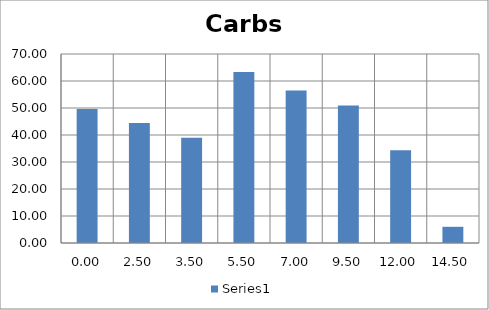
| Category | Series 0 |
|---|---|
| 0.0 | 49.584 |
| 2.5 | 44.4 |
| 3.5 | 39 |
| 5.5 | 63.3 |
| 7.0 | 56.52 |
| 9.5 | 50.97 |
| 12.0 | 34.32 |
| 14.5 | 6 |